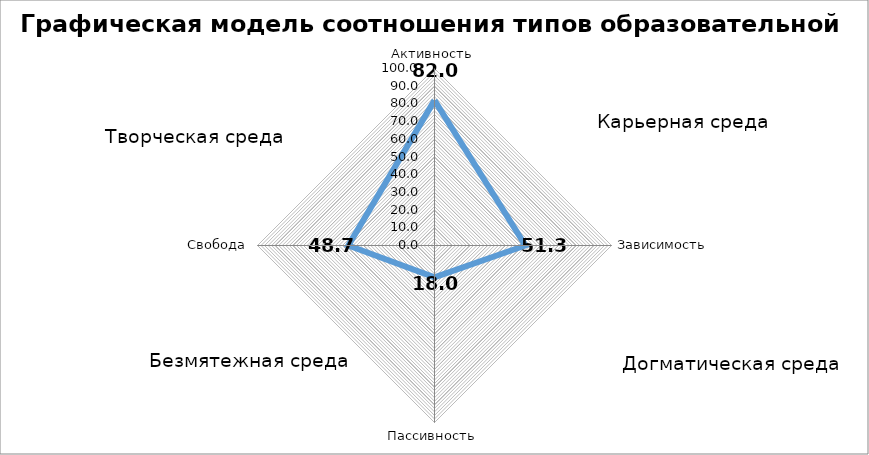
| Category | Графическая модель соотношения типов образовательной среды |
|---|---|
| Активность | 82 |
| Зависимость | 51.333 |
| Пассивность | 18 |
| Свобода | 48.667 |